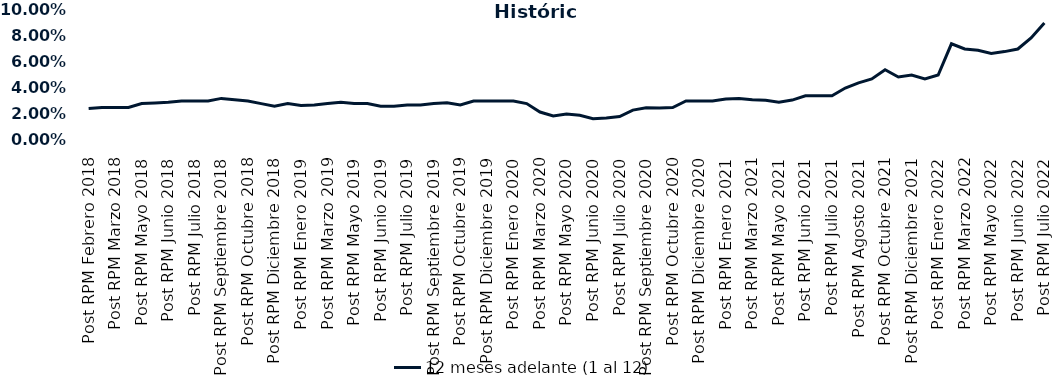
| Category | 12 meses adelante (1 al 12)  |
|---|---|
| Post RPM Febrero 2018 | 0.024 |
| Pre RPM Marzo 2018 | 0.025 |
| Post RPM Marzo 2018 | 0.025 |
| Pre RPM Mayo 2018 | 0.025 |
| Post RPM Mayo 2018 | 0.028 |
| Pre RPM Junio 2018 | 0.028 |
| Post RPM Junio 2018 | 0.029 |
| Pre RPM Julio 2018 | 0.03 |
| Post RPM Julio 2018 | 0.03 |
| Pre RPM Septiembre 2018 | 0.03 |
| Post RPM Septiembre 2018 | 0.032 |
| Pre RPM Octubre 2018 | 0.031 |
| Post RPM Octubre 2018 | 0.03 |
| Pre RPM Diciembre 2018 | 0.028 |
| Post RPM Diciembre 2018 | 0.026 |
| Pre RPM Enero 2019 | 0.028 |
| Post RPM Enero 2019 | 0.026 |
| Pre RPM Marzo 2019 | 0.027 |
| Post RPM Marzo 2019 | 0.028 |
| Pre RPM Mayo 2019 | 0.029 |
| Post RPM Mayo 2019 | 0.028 |
| Pre RPM Junio 2019 | 0.028 |
| Post RPM Junio 2019 | 0.026 |
| Pre RPM Julio 2019 | 0.026 |
| Post RPM Julio 2019 | 0.027 |
| Pre RPM Septiembre 2019 | 0.027 |
| Post RPM Septiembre 2019 | 0.028 |
| Pre RPM Octubre 2019 | 0.029 |
| Post RPM Octubre 2019 | 0.027 |
| Pre RPM Diciembre 2019 | 0.03 |
| Post RPM Diciembre 2019 | 0.03 |
| Pre RPM Enero 2020 | 0.03 |
| Post RPM Enero 2020 | 0.03 |
| Pre RPM Marzo 2020 | 0.028 |
| Post RPM Marzo 2020 | 0.022 |
| Pre RPM Mayo 2020 | 0.018 |
| Post RPM Mayo 2020 | 0.02 |
| Pre RPM Junio 2020 | 0.019 |
| Post RPM Junio 2020 | 0.016 |
| Pre RPM Julio 2020 | 0.017 |
| Post RPM Julio 2020 | 0.018 |
| Pre RPM Septiembre 2020 | 0.023 |
| Post RPM Septiembre 2020 | 0.025 |
| Pre RPM Octubre 2020 | 0.025 |
| Post RPM Octubre 2020 | 0.025 |
| Pre RPM Diciembre 2020 | 0.03 |
| Post RPM Diciembre 2020 | 0.03 |
| Pre RPM Enero 2021 | 0.03 |
| Post RPM Enero 2021 | 0.032 |
| Pre RPM Marzo 2021 | 0.032 |
| Post RPM Marzo 2021 | 0.031 |
| Pre RPM Mayo 2021 | 0.03 |
| Post RPM Mayo 2021 | 0.029 |
| Pre RPM Junio 2021 | 0.031 |
| Post RPM Junio 2021 | 0.034 |
| Pre RPM Julio 2021 | 0.034 |
| Post RPM Julio 2021 | 0.034 |
| Pre RPM Agosto 2021 | 0.04 |
| Post RPM Agosto 2021 | 0.044 |
| Pre RPM Octubre 2021 | 0.047 |
| Post RPM Octubre 2021 | 0.054 |
| Pre RPM Diciembre 2021 | 0.048 |
| Post RPM Diciembre 2021 | 0.05 |
| Pre RPM Enero 2022 | 0.047 |
| Post RPM Enero 2022 | 0.05 |
| Pre RPM Marzo 2022 | 0.074 |
| Post RPM Marzo 2022 | 0.07 |
| Pre RPM Mayo 2022 | 0.069 |
| Post RPM Mayo 2022 | 0.066 |
| Pre RPM Junio 2022 | 0.068 |
| Post RPM Junio 2022 | 0.07 |
| Pre RPM Julio 2022 | 0.078 |
| Post RPM Julio 2022 | 0.09 |